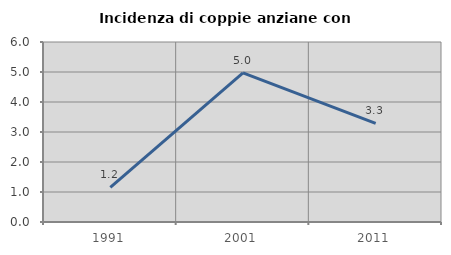
| Category | Incidenza di coppie anziane con figli |
|---|---|
| 1991.0 | 1.156 |
| 2001.0 | 4.972 |
| 2011.0 | 3.286 |